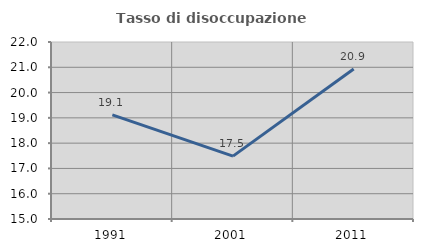
| Category | Tasso di disoccupazione giovanile  |
|---|---|
| 1991.0 | 19.118 |
| 2001.0 | 17.486 |
| 2011.0 | 20.93 |